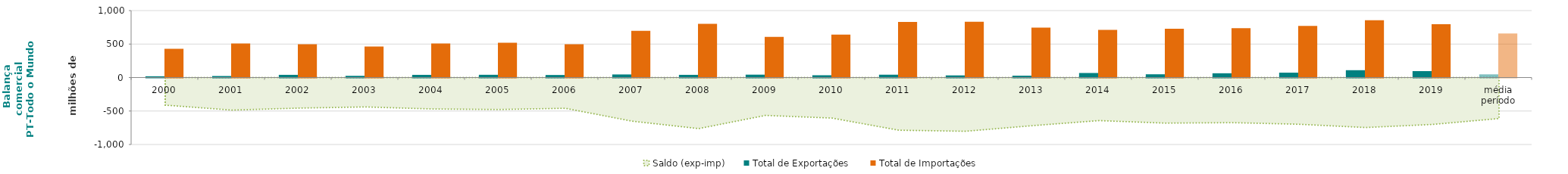
| Category | Total de Exportações  | Total de Importações  |
|---|---|---|
| 2000 | 18.76 | 430.782 |
| 2001 | 22.642 | 508.857 |
| 2002 | 40.29 | 496.847 |
| 2003 | 25.413 | 464.422 |
| 2004 | 40.041 | 509.224 |
| 2005 | 41.18 | 518.558 |
| 2006 | 38.041 | 497.247 |
| 2007 | 46.069 | 697.748 |
| 2008 | 40.182 | 802.757 |
| 2009 | 43.124 | 608.738 |
| 2010 | 34.269 | 640.042 |
| 2011 | 42.44 | 829.525 |
| 2012 | 32.005 | 834.33 |
| 2013 | 27.705 | 746.74 |
| 2014 | 67.868 | 710.988 |
| 2015 | 48.616 | 729.366 |
| 2016 | 63.8 | 737.446 |
| 2017 | 72.833 | 770.613 |
| 2018 | 109.722 | 856.184 |
| 2019 | 95.873 | 796.616 |
| média período | 47.544 | 659.352 |